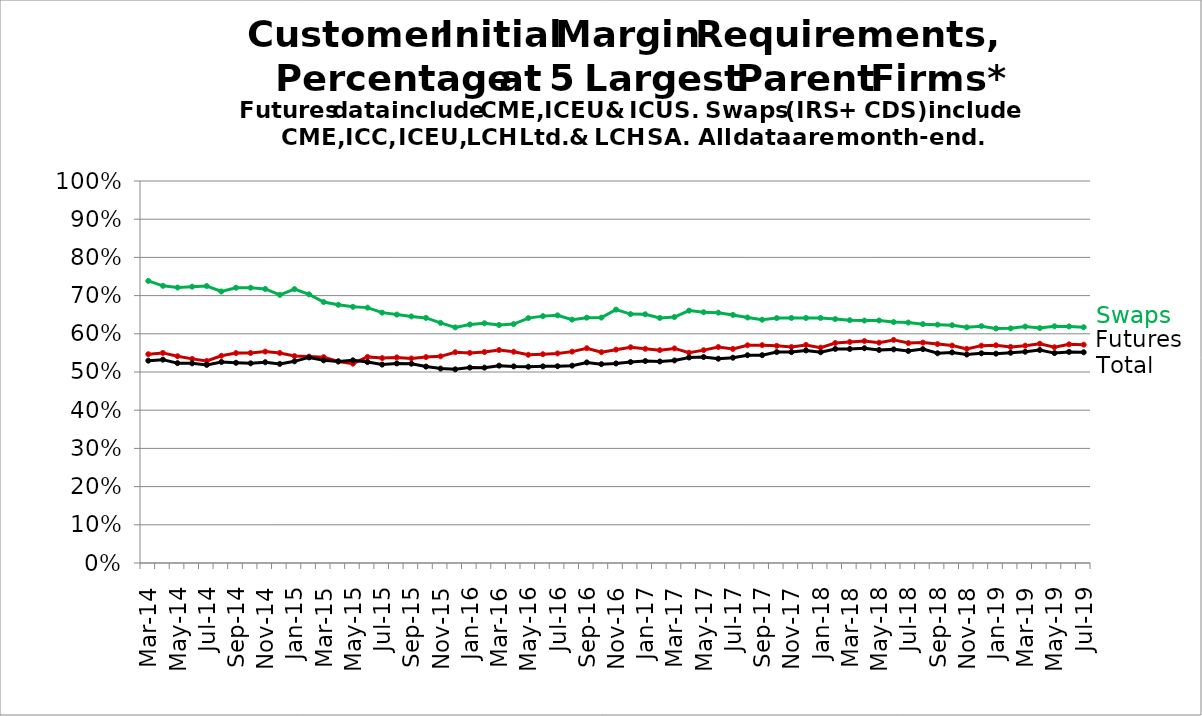
| Category | Futures | Swaps | Total | Series 8 | Series 9 |
|---|---|---|---|---|---|
| Mar-14 |  |  |  |  |  |
|   |  |  |  |  |  |
| May-14 |  |  |  |  |  |
|    |  |  |  |  |  |
| Jul-14 |  |  |  |  |  |
|   |  |  |  |  |  |
| Sep-14 |  |  |  |  |  |
|   |  |  |  |  |  |
| Nov-14 |  |  |  |  |  |
|   |  |  |  |  |  |
| Jan-15 |  |  |  |  |  |
|   |  |  |  |  |  |
| Mar-15 |  |  |  |  |  |
|   |  |  |  |  |  |
| May-15 |  |  |  |  |  |
|   |  |  |  |  |  |
| Jul-15 |  |  |  |  |  |
|   |  |  |  |  |  |
| Sep-15 |  |  |  |  |  |
|   |  |  |  |  |  |
| Nov-15 |  |  |  |  |  |
|   |  |  |  |  |  |
| Jan-16 |  |  |  |  |  |
|   |  |  |  |  |  |
| Mar-16 |  |  |  |  |  |
|   |  |  |  |  |  |
| May-16 |  |  |  |  |  |
|   |  |  |  |  |  |
| Jul-16 |  |  |  |  |  |
|   |  |  |  |  |  |
| Sep-16 |  |  |  |  |  |
|   |  |  |  |  |  |
| Nov-16 |  |  |  |  |  |
|   |  |  |  |  |  |
| Jan-17 |  |  |  |  |  |
|   |  |  |  |  |  |
| Mar-17 |  |  |  |  |  |
|   |  |  |  |  |  |
| May-17 |  |  |  |  |  |
|   |  |  |  |  |  |
| Jul-17 |  |  |  |  |  |
|   |  |  |  |  |  |
| Sep-17 |  |  |  |  |  |
|   |  |  |  |  |  |
| Nov-17 |  |  |  |  |  |
|   |  |  |  |  |  |
| Jan-18 |  |  |  |  |  |
|   |  |  |  |  |  |
| Mar-18 |  |  |  |  |  |
|   |  |  |  |  |  |
| May-18 |  |  |  |  |  |
|   |  |  |  |  |  |
| Jul-18 |  |  |  |  |  |
|   |  |  |  |  |  |
| Sep-18 |  |  |  |  |  |
|   |  |  |  |  |  |
| Nov-18 |  |  |  |  |  |
|   |  |  |  |  |  |
| Jan-19 |  |  |  |  |  |
|   |  |  |  |  |  |
| Mar-19 |  |  |  |  |  |
|   |  |  |  |  |  |
| May-19 |  |  |  |  |  |
|   |  |  |  |  |  |
| Jul-19 |  |  |  |  |  |